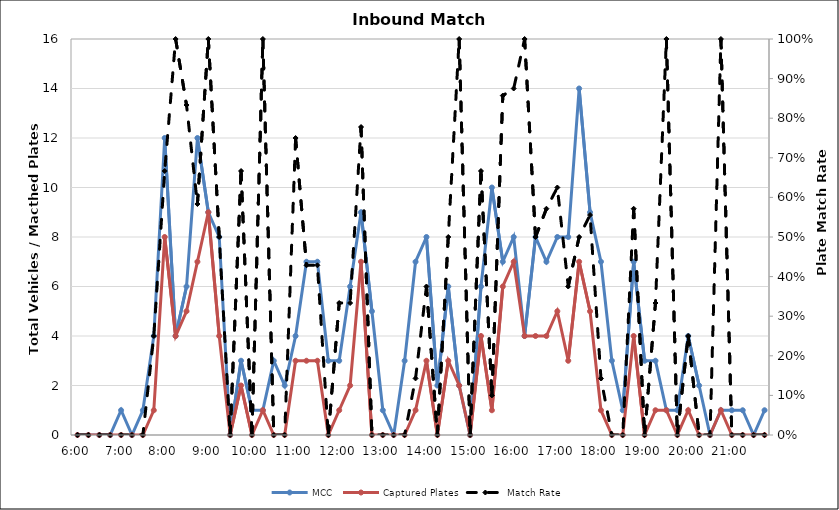
| Category | MCC | Captured Plates |
|---|---|---|
| 0.25 | 0 | 0 |
| 0.260416666666667 | 0 | 0 |
| 0.270833333333333 | 0 | 0 |
| 0.28125 | 0 | 0 |
| 0.291666666666667 | 1 | 0 |
| 0.302083333333333 | 0 | 0 |
| 0.3125 | 1 | 0 |
| 0.322916666666667 | 4 | 1 |
| 0.333333333333333 | 12 | 8 |
| 0.34375 | 4 | 4 |
| 0.354166666666667 | 6 | 5 |
| 0.364583333333333 | 12 | 7 |
| 0.375 | 9 | 9 |
| 0.385416666666667 | 8 | 4 |
| 0.395833333333333 | 0 | 0 |
| 0.40625 | 3 | 2 |
| 0.416666666666667 | 1 | 0 |
| 0.427083333333333 | 1 | 1 |
| 0.4375 | 3 | 0 |
| 0.447916666666667 | 2 | 0 |
| 0.458333333333333 | 4 | 3 |
| 0.46875 | 7 | 3 |
| 0.479166666666667 | 7 | 3 |
| 0.489583333333333 | 3 | 0 |
| 0.5 | 3 | 1 |
| 0.510416666666667 | 6 | 2 |
| 0.520833333333333 | 9 | 7 |
| 0.53125 | 5 | 0 |
| 0.541666666666667 | 1 | 0 |
| 0.552083333333333 | 0 | 0 |
| 0.5625 | 3 | 0 |
| 0.572916666666667 | 7 | 1 |
| 0.583333333333333 | 8 | 3 |
| 0.59375 | 2 | 0 |
| 0.604166666666667 | 6 | 3 |
| 0.614583333333333 | 2 | 2 |
| 0.625 | 0 | 0 |
| 0.635416666666667 | 6 | 4 |
| 0.645833333333333 | 10 | 1 |
| 0.65625 | 7 | 6 |
| 0.666666666666667 | 8 | 7 |
| 0.677083333333333 | 4 | 4 |
| 0.6875 | 8 | 4 |
| 0.697916666666667 | 7 | 4 |
| 0.708333333333333 | 8 | 5 |
| 0.71875 | 8 | 3 |
| 0.729166666666667 | 14 | 7 |
| 0.739583333333333 | 9 | 5 |
| 0.75 | 7 | 1 |
| 0.760416666666667 | 3 | 0 |
| 0.770833333333333 | 1 | 0 |
| 0.78125 | 7 | 4 |
| 0.791666666666667 | 3 | 0 |
| 0.802083333333333 | 3 | 1 |
| 0.8125 | 1 | 1 |
| 0.822916666666667 | 1 | 0 |
| 0.833333333333333 | 4 | 1 |
| 0.84375 | 2 | 0 |
| 0.854166666666667 | 0 | 0 |
| 0.864583333333333 | 1 | 1 |
| 0.875 | 1 | 0 |
| 0.885416666666667 | 1 | 0 |
| 0.895833333333333 | 0 | 0 |
| 0.90625 | 1 | 0 |